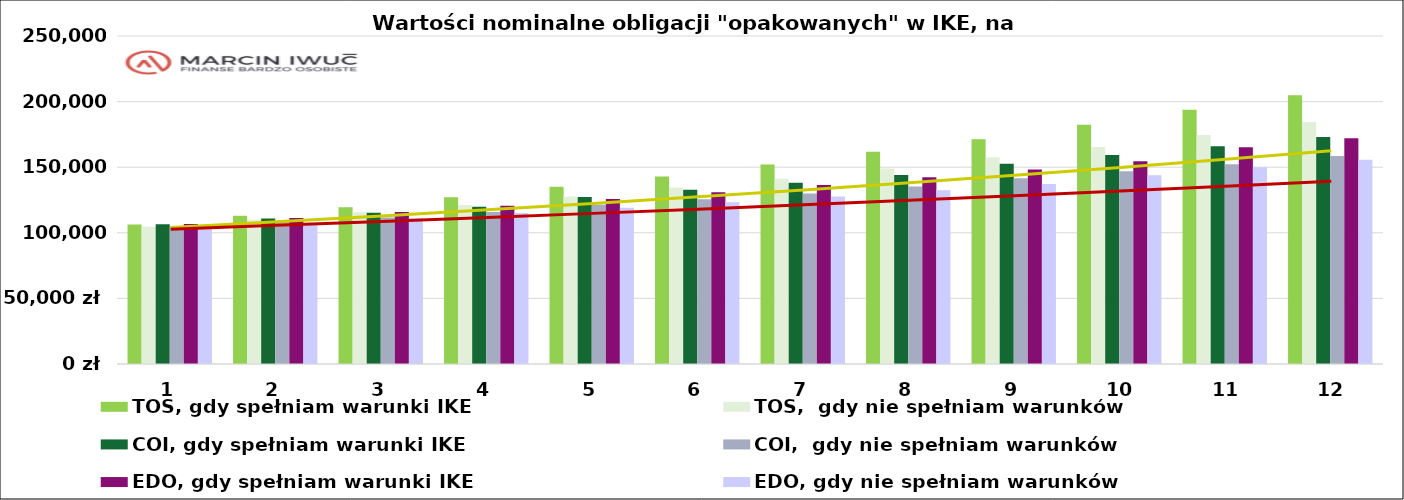
| Category | TOS, gdy spełniam warunki IKE | TOS,  gdy nie spełniam warunków | COI, gdy spełniam warunki IKE | COI,  gdy nie spełniam warunków | EDO, gdy spełniam warunki IKE | EDO, gdy nie spełniam warunków |
|---|---|---|---|---|---|---|
| 0 | 106400 | 104617 | 106550 | 104738.5 | 106800 | 103888 |
| 1 | 113028.465 | 109951.641 | 110848.109 | 108149.361 | 111214.172 | 107429.616 |
| 2 | 119494.086 | 115721.635 | 115282.658 | 111682.876 | 115829.772 | 111135.14 |
| 3 | 127108.878 | 121175.829 | 119910.855 | 115940.599 | 120655.96 | 115012.119 |
| 4 | 135097.031 | 127612.687 | 127351.257 | 121340.916 | 125702.314 | 119068.447 |
| 5 | 142892.333 | 134573.933 | 132731.463 | 125625.902 | 130978.843 | 123312.38 |
| 6 | 152077.285 | 141165.826 | 138239.55 | 130027.167 | 136496.011 | 127752.551 |
| 7 | 161818.721 | 149024.844 | 143994.111 | 135218.713 | 142264.759 | 132397.99 |
| 8 | 171320.238 | 157503.037 | 152602.51 | 141538.008 | 148281.563 | 137243.182 |
| 9 | 182260.64 | 165352.326 | 159256.245 | 146847.668 | 154557.089 | 143916.718 |
| 10 | 193717.58 | 174595.871 | 166026.941 | 152261.521 | 165161.216 | 149956.584 |
| 11 | 204780.901 | 184497.803 | 173080.159 | 158516.905 | 172156.011 | 155589.319 |